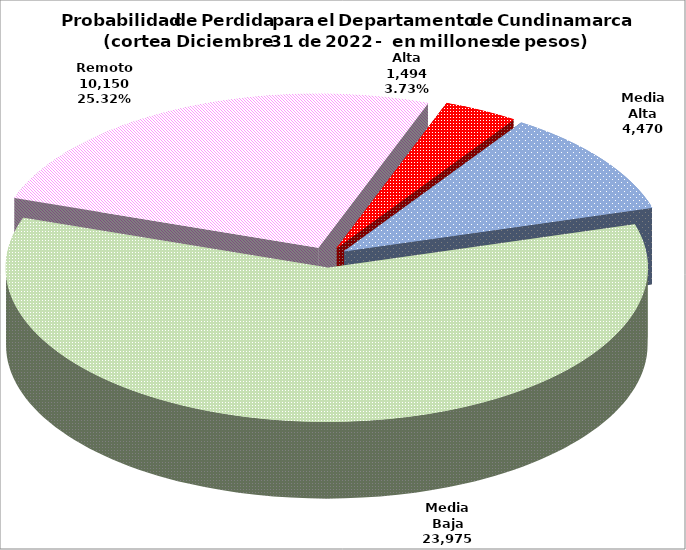
| Category | Series 0 |
|---|---|
| Alta | 1494.393 |
| Media Alta | 4470.329 |
| Media Baja | 23974.733 |
| Remoto | 10149.722 |